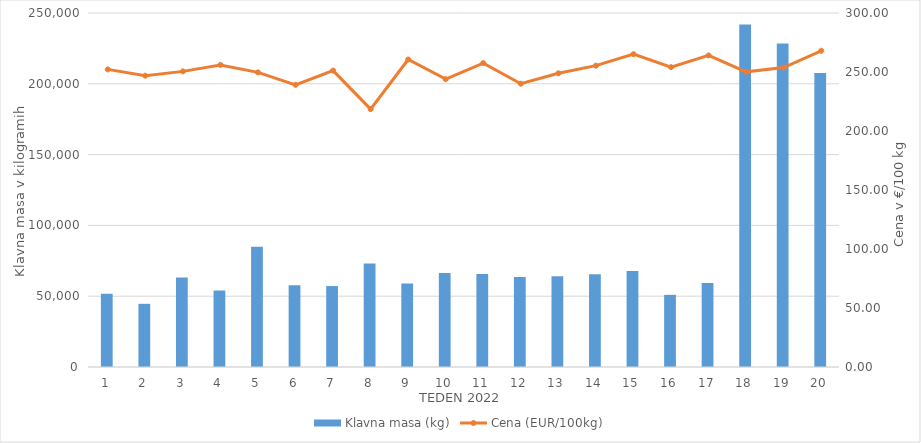
| Category | Klavna masa (kg) |
|---|---|
| 1.0 | 51818 |
| 2.0 | 44619 |
| 3.0 | 63233 |
| 4.0 | 53993 |
| 5.0 | 84871 |
| 6.0 | 57648 |
| 7.0 | 57159 |
| 8.0 | 73139 |
| 9.0 | 59056 |
| 10.0 | 66417 |
| 11.0 | 65723 |
| 12.0 | 63530 |
| 13.0 | 64069 |
| 14.0 | 65564 |
| 15.0 | 67787 |
| 16.0 | 50958 |
| 17.0 | 59387 |
| 18.0 | 241833 |
| 19.0 | 228389 |
| 20.0 | 207661 |